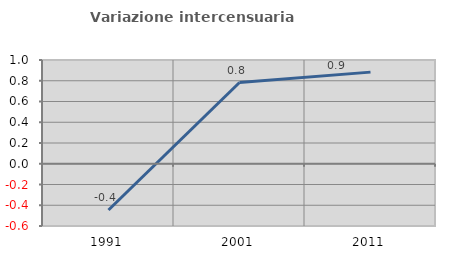
| Category | Variazione intercensuaria annua |
|---|---|
| 1991.0 | -0.446 |
| 2001.0 | 0.783 |
| 2011.0 | 0.883 |